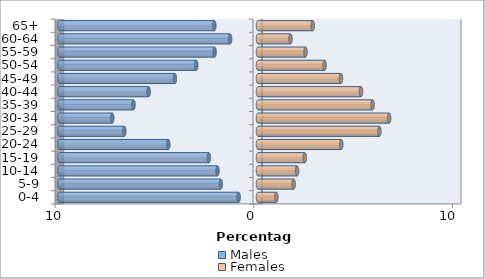
| Category | Males | Females |
|---|---|---|
| 0-4 | -0.974 | 0.926 |
| 5-9 | -1.871 | 1.796 |
| 10-14 | -2.038 | 1.967 |
| 15-19 | -2.474 | 2.355 |
| 20-24 | -4.514 | 4.192 |
| 25-29 | -6.731 | 6.111 |
| 30-34 | -7.335 | 6.601 |
| 35-39 | -6.268 | 5.766 |
| 40-44 | -5.504 | 5.184 |
| 45-49 | -4.185 | 4.178 |
| 50-54 | -3.108 | 3.351 |
| 55-59 | -2.184 | 2.392 |
| 60-64 | -1.404 | 1.635 |
| 65+ | -2.198 | 2.755 |